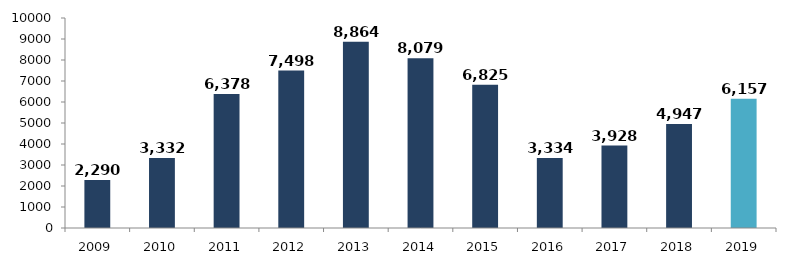
| Category | Series 0 |
|---|---|
| 2009.0 | 2290.273 |
| 2010.0 | 3331.554 |
| 2011.0 | 6377.615 |
| 2012.0 | 7498.207 |
| 2013.0 | 8863.622 |
| 2014.0 | 8079.21 |
| 2015.0 | 6824.624 |
| 2016.0 | 3333.564 |
| 2017.0 | 3928.017 |
| 2018.0 | 4947.435 |
| 2019.0 | 6157.132 |